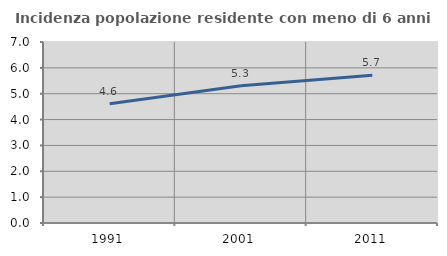
| Category | Incidenza popolazione residente con meno di 6 anni |
|---|---|
| 1991.0 | 4.609 |
| 2001.0 | 5.306 |
| 2011.0 | 5.714 |